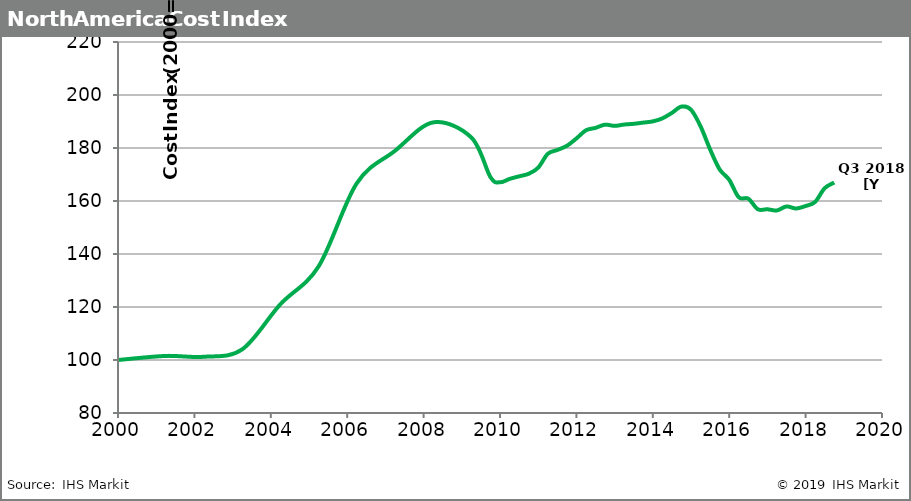
| Category | Series 1 |
|---|---|
| 2000.0 | 100 |
| 2001.25 | 101.535 |
| 2002.25 | 101.213 |
| 2003.25 | 104.003 |
| 2004.25 | 121.033 |
| 2005.25 | 135.289 |
| 2006.25 | 166.678 |
| 2007.25 | 178.923 |
| 2008.25 | 189.661 |
| 2009.25 | 183.962 |
| 2009.75 | 169.006 |
| 2010.0 | 167.061 |
| 2010.25 | 168.33 |
| 2010.5 | 169.306 |
| 2010.75 | 170.27 |
| 2011.0 | 172.583 |
| 2011.25 | 177.791 |
| 2011.5 | 179.246 |
| 2011.75 | 180.821 |
| 2012.0 | 183.594 |
| 2012.25 | 186.682 |
| 2012.5 | 187.592 |
| 2012.75 | 188.807 |
| 2013.0 | 188.343 |
| 2013.25 | 188.852 |
| 2013.5 | 189.128 |
| 2013.75 | 189.58 |
| 2014.0 | 190.043 |
| 2014.25 | 191.172 |
| 2014.5 | 193.252 |
| 2014.75 | 195.639 |
| 2015.0 | 194.436 |
| 2015.25 | 188.205 |
| 2015.5 | 179.469 |
| 2015.75 | 171.907 |
| 2016.0 | 168 |
| 2016.25 | 161.413 |
| 2016.5 | 160.883 |
| 2016.75 | 156.887 |
| 2017.0 | 156.876 |
| 2017.25 | 156.441 |
| 2017.5 | 157.948 |
| 2017.75 | 157.166 |
| 2018.0 | 158.107 |
| 2018.25 | 159.66 |
| 2018.5 | 164.848 |
| 2018.75 | 166.962 |